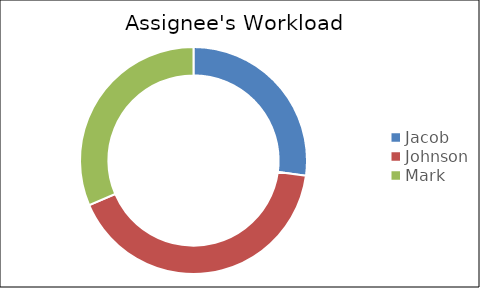
| Category | Total |
|---|---|
| Jacob | 57 |
| Johnson | 87 |
| Mark | 66 |